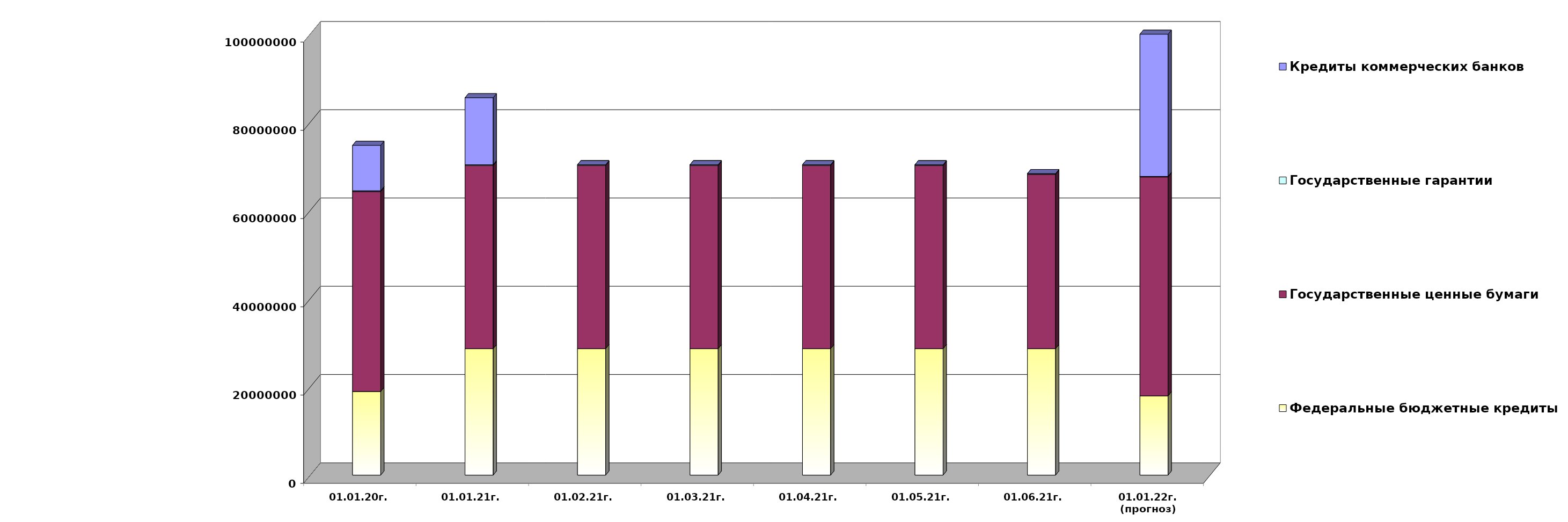
| Category | Федеральные бюджетные кредиты | Государственные ценные бумаги  | Государственные гарантии | Кредиты коммерческих банков |
|---|---|---|---|---|
| 01.01.20г. | 18954967.463 | 45300000 | 186330.02 | 10291177 |
| 01.01.21г. | 28654967.463 | 41500000 | 184738.25 | 15190000 |
| 01.02.21г. | 28654967.463 | 41500000 | 182966.25 | 0 |
| 01.03.21г. | 28654967.463 | 41500000 | 182966.25 | 0 |
| 01.04.21г. | 28654967.463 | 41500000 | 182966.25 | 0 |
| 01.05.21г. | 28654967.463 | 41500000 | 174735.46 | 0 |
| 01.06.21г. | 28654967.463 | 39500000 | 174735.46 | 0 |
| 01.01.22г.
(прогноз) | 17952908.7 | 49600000 | 141570.7 | 32225586.7 |